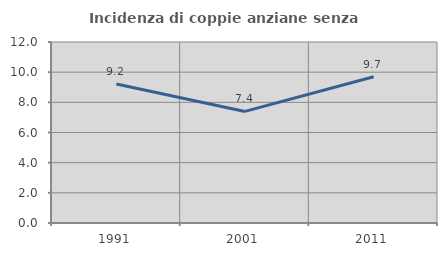
| Category | Incidenza di coppie anziane senza figli  |
|---|---|
| 1991.0 | 9.218 |
| 2001.0 | 7.398 |
| 2011.0 | 9.697 |